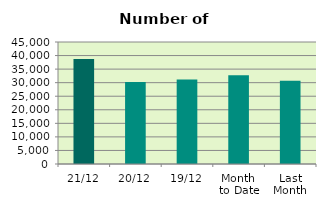
| Category | Series 0 |
|---|---|
| 21/12 | 38734 |
| 20/12 | 30240 |
| 19/12 | 31134 |
| Month 
to Date | 32757.6 |
| Last
Month | 30687.818 |